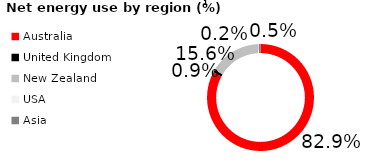
| Category | Net energy use by region |
|---|---|
| Australia | 0.828 |
| United Kingdom | 0.008 |
| New Zealand | 0.156 |
| USA | 0.002 |
| Asia | 0.005 |